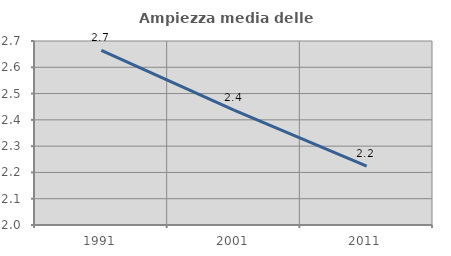
| Category | Ampiezza media delle famiglie |
|---|---|
| 1991.0 | 2.664 |
| 2001.0 | 2.437 |
| 2011.0 | 2.224 |